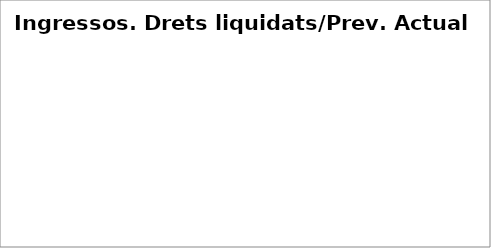
| Category | Series 0 |
|---|---|
| Impostos directes | 0.298 |
| Impostos indirectes | 0.226 |
| Taxes, preus públics i altres ingressos | 0.176 |
| Transferències corrents | 0.247 |
| Ingressos patrimonials | 0.089 |
| Venda d'inversions reals | 1.107 |
| Transferències de capital | 0.024 |
| Actius financers* | 0 |
| Passius financers | 0.009 |